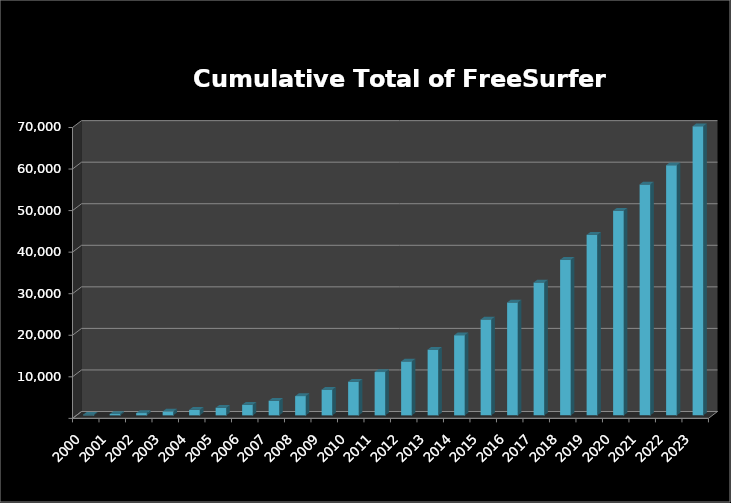
| Category | Cumulative Total of Licenses |
|---|---|
| 2000 | 172 |
| 2001 | 321 |
| 2002 | 551 |
| 2003 | 943 |
| 2004 | 1328 |
| 2005 | 1828 |
| 2006 | 2550 |
| 2007 | 3512 |
| 2008 | 4638 |
| 2009 | 6187 |
| 2010 | 8101 |
| 2011 | 10427 |
| 2012 | 12975 |
| 2013 | 15806 |
| 2014 | 19295 |
| 2015 | 23082 |
| 2016 | 27170 |
| 2017 | 31976 |
| 2018 | 37455 |
| 2019 | 43439 |
| 2020 | 49265 |
| 2021 | 55587 |
| 2022 | 60203 |
| 2023 | 69579 |